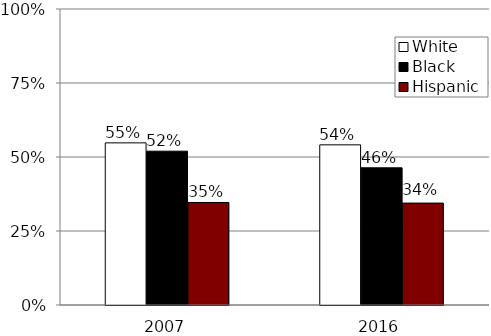
| Category | White | Black | Hispanic |
|---|---|---|---|
| 2007.0 | 0.548 | 0.52 | 0.346 |
| 2016.0 | 0.541 | 0.463 | 0.344 |